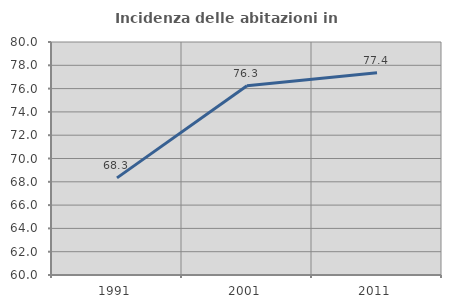
| Category | Incidenza delle abitazioni in proprietà  |
|---|---|
| 1991.0 | 68.337 |
| 2001.0 | 76.252 |
| 2011.0 | 77.364 |